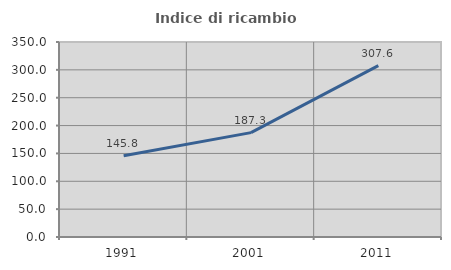
| Category | Indice di ricambio occupazionale  |
|---|---|
| 1991.0 | 145.775 |
| 2001.0 | 187.302 |
| 2011.0 | 307.634 |